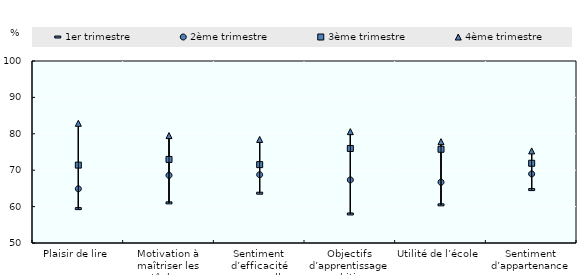
| Category | Series 0 | Series 1 | Series 2 | Series 3 |
|---|---|---|---|---|
| 0 | 59.447 | 64.897 | 71.397 | 82.886 |
| 1 | 61.027 | 68.596 | 72.962 | 79.507 |
| 2 | 63.682 | 68.764 | 71.528 | 78.452 |
| 3 | 57.978 | 67.344 | 75.973 | 80.596 |
| 4 | 60.487 | 66.704 | 75.755 | 77.836 |
| 5 | 64.672 | 68.985 | 71.909 | 75.297 |